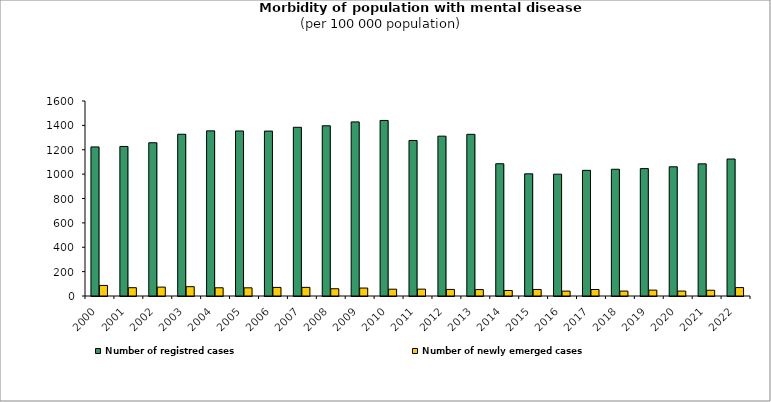
| Category | Number of registred cases  | Number of newly emerged cases  |
|---|---|---|
| 2000.0 | 1223.1 | 86.8 |
| 2001.0 | 1227.1 | 68.2 |
| 2002.0 | 1257.5 | 73 |
| 2003.0 | 1327.2 | 76.6 |
| 2004.0 | 1355 | 67.5 |
| 2005.0 | 1354.1 | 67.1 |
| 2006.0 | 1353.2 | 70.5 |
| 2007.0 | 1384.3 | 70.8 |
| 2008.0 | 1396.707 | 59.5 |
| 2009.0 | 1428.584 | 65.2 |
| 2010.0 | 1440.5 | 55.8 |
| 2011.0 | 1276.2 | 56.4 |
| 2012.0 | 1311.5 | 53.9 |
| 2013.0 | 1326.6 | 52.7 |
| 2014.0 | 1085.3 | 45.4 |
| 2015.0 | 1002.322 | 53.592 |
| 2016.0 | 999.5 | 40.1 |
| 2017.0 | 1030.9 | 53.3 |
| 2018.0 | 1040 | 40.5 |
| 2019.0 | 1045.2 | 48.3 |
| 2020.0 | 1060.2 | 40.4 |
| 2021.0 | 1084.2 | 47.3 |
| 2022.0 | 1124.1 | 69.2 |